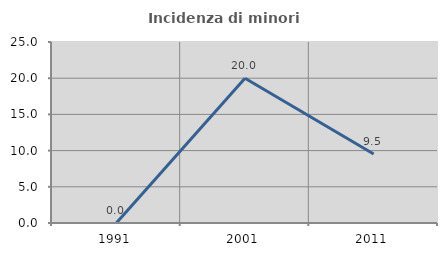
| Category | Incidenza di minori stranieri |
|---|---|
| 1991.0 | 0 |
| 2001.0 | 20 |
| 2011.0 | 9.524 |